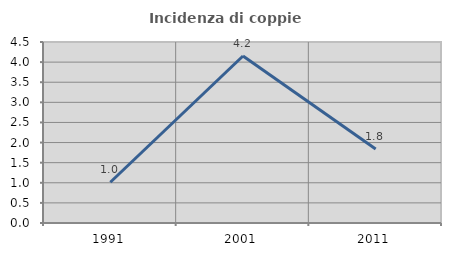
| Category | Incidenza di coppie miste |
|---|---|
| 1991.0 | 1.012 |
| 2001.0 | 4.152 |
| 2011.0 | 1.84 |